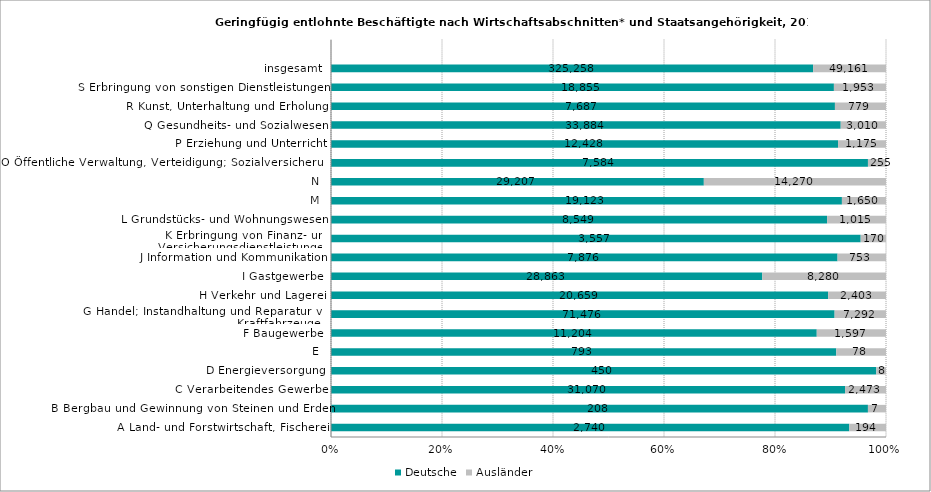
| Category | Deutsche | Ausländer |
|---|---|---|
| A Land- und Forstwirtschaft, Fischerei | 2740 | 194 |
| B Bergbau und Gewinnung von Steinen und Erden | 208 | 7 |
| C Verarbeitendes Gewerbe | 31070 | 2473 |
| D Energieversorgung | 450 | 8 |
| E | 793 | 78 |
| F Baugewerbe | 11204 | 1597 |
| G Handel; Instandhaltung und Reparatur von Kraftfahrzeugen | 71476 | 7292 |
| H Verkehr und Lagerei | 20659 | 2403 |
| I Gastgewerbe | 28863 | 8280 |
| J Information und Kommunikation | 7876 | 753 |
| K Erbringung von Finanz- und Versicherungsdienstleistungen | 3557 | 170 |
| L Grundstücks- und Wohnungswesen | 8549 | 1015 |
| M | 19123 | 1650 |
| N | 29207 | 14270 |
| O Öffentliche Verwaltung, Verteidigung; Sozialversicherung | 7584 | 255 |
| P Erziehung und Unterricht | 12428 | 1175 |
| Q Gesundheits- und Sozialwesen | 33884 | 3010 |
| R Kunst, Unterhaltung und Erholung | 7687 | 779 |
| S Erbringung von sonstigen Dienstleistungen | 18855 | 1953 |
| insgesamt | 325258 | 49161 |